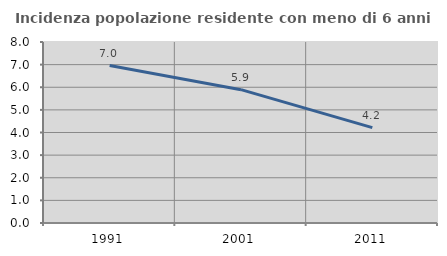
| Category | Incidenza popolazione residente con meno di 6 anni |
|---|---|
| 1991.0 | 6.958 |
| 2001.0 | 5.894 |
| 2011.0 | 4.214 |